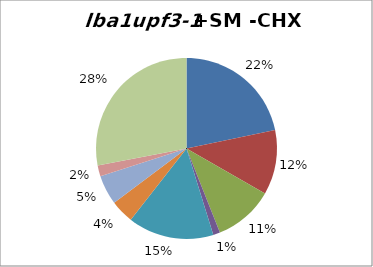
| Category | Series 0 |
|---|---|
| protein metabolism | 177 |
| misc | 94 |
| RNA | 87 |
| DNA | 10 |
| metabolism | 125 |
| signalling | 34 |
| cell division and development | 43 |
| stress | 16 |
| not assigned | 228 |